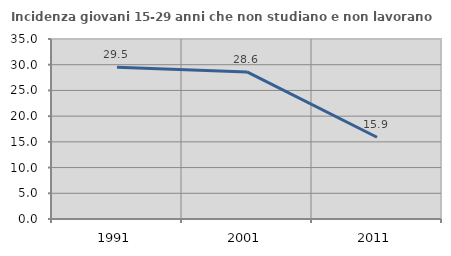
| Category | Incidenza giovani 15-29 anni che non studiano e non lavorano  |
|---|---|
| 1991.0 | 29.518 |
| 2001.0 | 28.597 |
| 2011.0 | 15.891 |